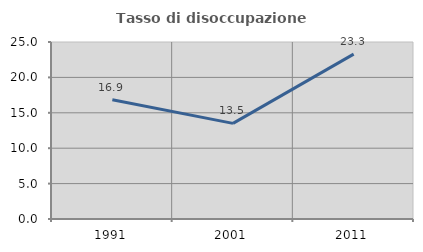
| Category | Tasso di disoccupazione giovanile  |
|---|---|
| 1991.0 | 16.854 |
| 2001.0 | 13.503 |
| 2011.0 | 23.292 |